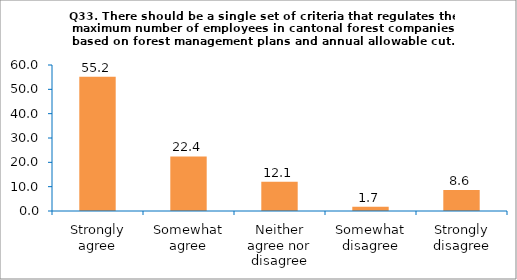
| Category | Series 0 |
|---|---|
| Strongly agree | 55.172 |
| Somewhat agree | 22.414 |
| Neither agree nor disagree | 12.069 |
| Somewhat disagree | 1.724 |
| Strongly disagree | 8.621 |